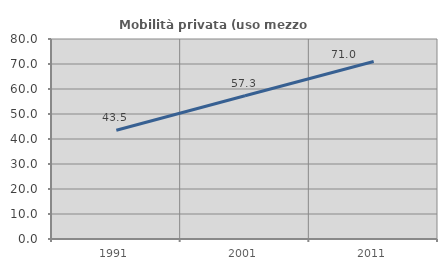
| Category | Mobilità privata (uso mezzo privato) |
|---|---|
| 1991.0 | 43.526 |
| 2001.0 | 57.306 |
| 2011.0 | 71.005 |